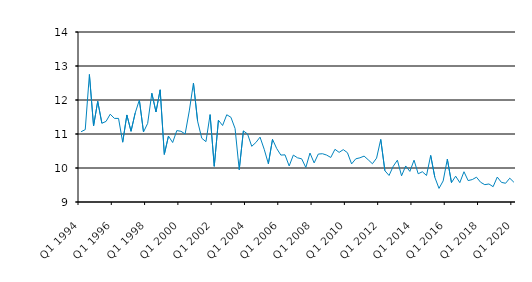
| Category | Series 0 |
|---|---|
| Q1 1994 | 11.067 |
| Q2 1994 | 11.129 |
| Q3 1994 | 12.75 |
| Q4 1994 | 11.238 |
| Q1 1995 | 11.961 |
| Q2 1995 | 11.316 |
| Q3 1995 | 11.37 |
| Q4 1995 | 11.583 |
| Q1 1996 | 11.46 |
| Q2 1996 | 11.458 |
| Q3 1996 | 10.759 |
| Q4 1996 | 11.56 |
| Q1 1997 | 11.08 |
| Q2 1997 | 11.616 |
| Q3 1997 | 12 |
| Q4 1997 | 11.059 |
| Q1 1998 | 11.312 |
| Q2 1998 | 12.199 |
| Q3 1998 | 11.649 |
| Q4 1998 | 12.3 |
| Q1 1999 | 10.4 |
| Q2 1999 | 10.939 |
| Q3 1999 | 10.75 |
| Q4 1999 | 11.1 |
| Q1 2000 | 11.08 |
| Q2 2000 | 11 |
| Q3 2000 | 11.679 |
| Q4 2000 | 12.5 |
| Q1 2001 | 11.375 |
| Q2 2001 | 10.875 |
| Q3 2001 | 10.775 |
| Q4 2001 | 11.57 |
| Q1 2002 | 10.05 |
| Q2 2002 | 11.405 |
| Q3 2002 | 11.25 |
| Q4 2002 | 11.566 |
| Q1 2003 | 11.492 |
| Q2 2003 | 11.162 |
| Q3 2003 | 9.95 |
| Q4 2003 | 11.091 |
| Q1 2004 | 11 |
| Q2 2004 | 10.638 |
| Q3 2004 | 10.75 |
| Q4 2004 | 10.908 |
| Q1 2005 | 10.55 |
| Q2 2005 | 10.125 |
| Q3 2005 | 10.843 |
| Q4 2005 | 10.573 |
| Q1 2006 | 10.38 |
| Q2 2006 | 10.387 |
| Q3 2006 | 10.06 |
| Q4 2006 | 10.38 |
| Q1 2007 | 10.3 |
| Q2 2007 | 10.27 |
| Q3 2007 | 10.017 |
| Q4 2007 | 10.44 |
| Q1 2008 | 10.15 |
| Q2 2008 | 10.41 |
| Q3 2008 | 10.42 |
| Q4 2008 | 10.38 |
| Q1 2009 | 10.31 |
| Q2 2009 | 10.55 |
| Q3 2009 | 10.46 |
| Q4 2009 | 10.54 |
| Q1 2010 | 10.45 |
| Q2 2010 | 10.12 |
| Q3 2010 | 10.27 |
| Q4 2010 | 10.3 |
| Q1 2011 | 10.35 |
| Q2 2011 | 10.24 |
| Q3 2011 | 10.125 |
| Q4 2011 | 10.29 |
| Q1 2012 | 10.84 |
| Q2 2012 | 9.92 |
| Q3 2012 | 9.78 |
| Q4 2012 | 10.05 |
| Q1 2013 | 10.23 |
| Q2 2013 | 9.77 |
| Q3 2013 | 10.06 |
| Q4 2013 | 9.9 |
| Q1 2014 | 10.23 |
| Q2 2014 | 9.83 |
| Q3 2014 | 9.89 |
| Q4 2014 | 9.78 |
| Q1 2015 | 10.37 |
| Q2 2015 | 9.726 |
| Q3 2015 | 9.4 |
| Q4 2015 | 9.62 |
| Q1 2016 | 10.26 |
| Q2 2016 | 9.57 |
| Q3 2016 | 9.76 |
| Q4 2016 | 9.57 |
| Q1 2017 | 9.89 |
| Q2 2017 | 9.63 |
| Q3 2017 | 9.66 |
| Q4 2017 | 9.73 |
| Q1 2018 | 9.58 |
| Q2 2018 | 9.51 |
| Q3 2018 | 9.53 |
| Q4 2018 | 9.45 |
| Q1 2019 | 9.733 |
| Q2 2019 | 9.578 |
| Q3 2019 | 9.551 |
| Q4 2019 | 9.7 |
| Q1 2020 | 9.58 |